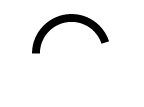
| Category | Series 0 |
|---|---|
| Parte Visível da rosca | 0 |
| Metade da meta alcançada | 0.45 |
| Diferenças | 0.55 |